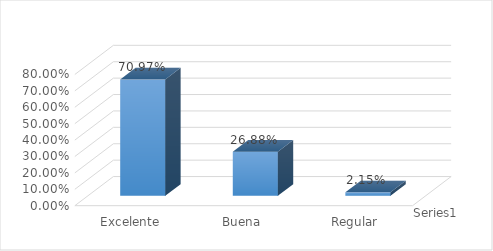
| Category | Series 0 |
|---|---|
| Excelente | 0.71 |
| Buena | 0.269 |
| Regular | 0.022 |